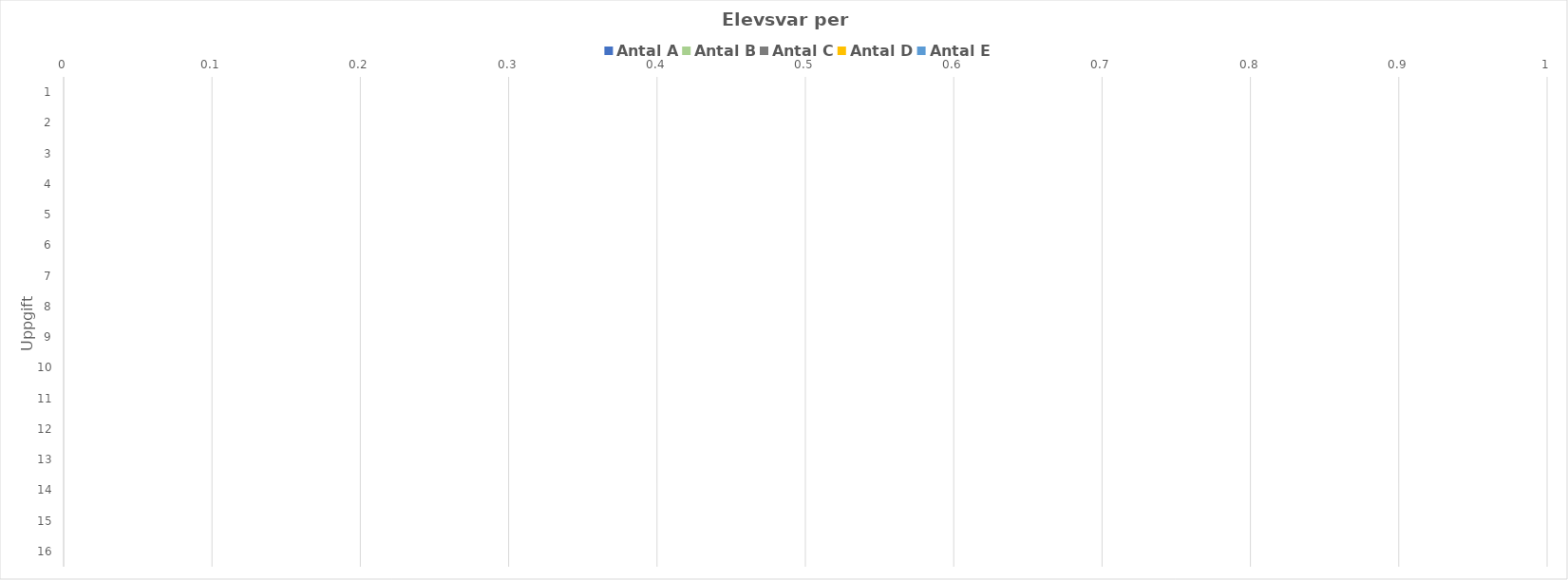
| Category | Antal A | Antal B | Antal C | Antal D | Antal E |
|---|---|---|---|---|---|
| 0 | 0 | 0 | 0 | 0 | 0 |
| 1 | 0 | 0 | 0 | 0 | 0 |
| 2 | 0 | 0 | 0 | 0 | 0 |
| 3 | 0 | 0 | 0 | 0 | 0 |
| 4 | 0 | 0 | 0 | 0 | 0 |
| 5 | 0 | 0 | 0 | 0 | 0 |
| 6 | 0 | 0 | 0 | 0 | 0 |
| 7 | 0 | 0 | 0 | 0 | 0 |
| 8 | 0 | 0 | 0 | 0 | 0 |
| 9 | 0 | 0 | 0 | 0 | 0 |
| 10 | 0 | 0 | 0 | 0 | 0 |
| 11 | 0 | 0 | 0 | 0 | 0 |
| 12 | 0 | 0 | 0 | 0 | 0 |
| 13 | 0 | 0 | 0 | 0 | 0 |
| 14 | 0 | 0 | 0 | 0 | 0 |
| 15 | 0 | 0 | 0 | 0 | 0 |